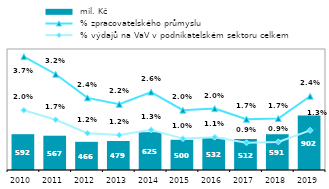
| Category |  mil. Kč |
|---|---|
| 2010.0 | 592.056 |
| 2011.0 | 566.742 |
| 2012.0 | 465.578 |
| 2013.0 | 479.388 |
| 2014.0 | 625.195 |
| 2015.0 | 499.552 |
| 2016.0 | 531.732 |
| 2017.0 | 512.334 |
| 2018.0 | 591.173 |
| 2019.0 | 901.621 |